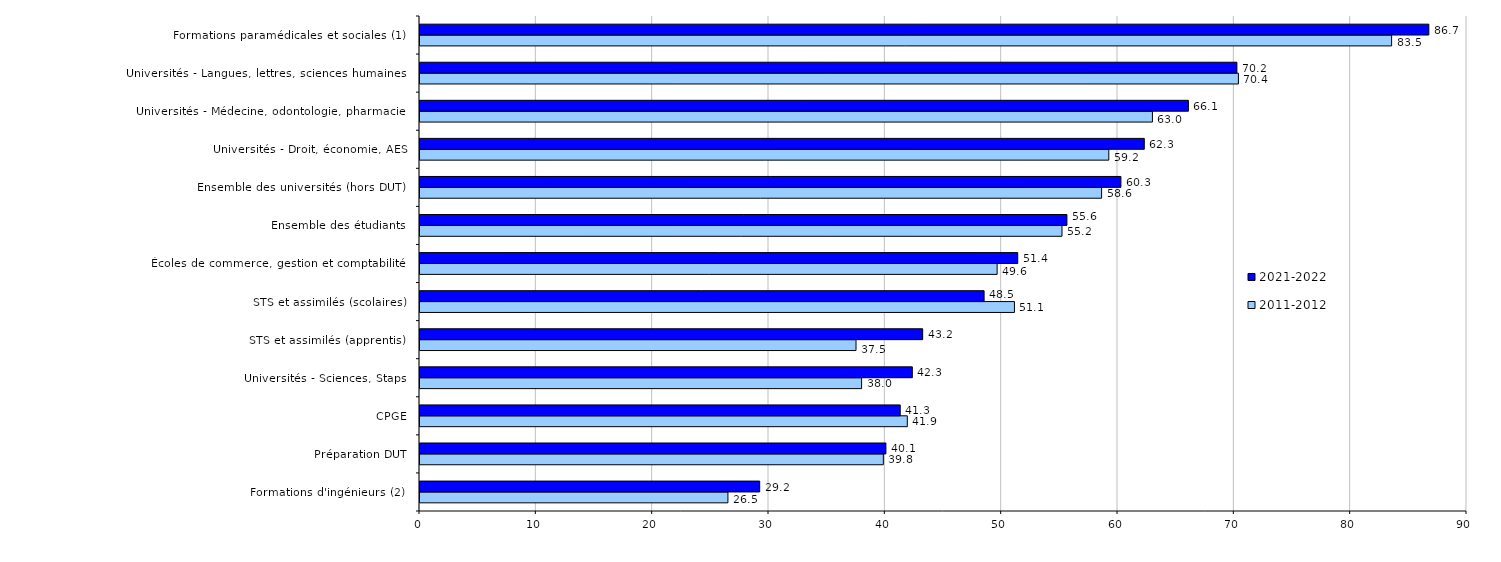
| Category | 2011-2012 | 2021-2022 |
|---|---|---|
| Formations d'ingénieurs (2) | 26.47 | 29.2 |
| Préparation DUT | 39.83 | 40.05 |
| CPGE | 41.89 | 41.28 |
| Universités - Sciences, Staps | 37.96 | 42.32 |
| STS et assimilés (apprentis) | 37.48 | 43.21 |
| STS et assimilés (scolaires) | 51.1 | 48.49 |
| Écoles de commerce, gestion et comptabilité | 49.61 | 51.38 |
| Ensemble des étudiants | 55.186 | 55.61 |
| Ensemble des universités (hors DUT) | 58.59 | 60.25 |
| Universités - Droit, économie, AES | 59.21 | 62.26 |
| Universités - Médecine, odontologie, pharmacie | 62.96 | 66.05 |
| Universités - Langues, lettres, sciences humaines | 70.35 | 70.22 |
| Formations paramédicales et sociales (1) | 83.52 | 86.72 |